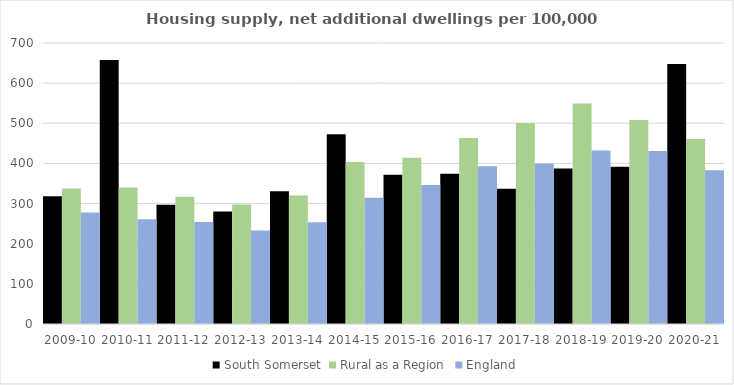
| Category | South Somerset | Rural as a Region | England |
|---|---|---|---|
| 2009-10 | 318.276 | 337.852 | 277.548 |
| 2010-11 | 657.918 | 340.105 | 260.994 |
| 2011-12 | 297.323 | 317.04 | 254.007 |
| 2012-13 | 280.303 | 297.763 | 233.153 |
| 2013-14 | 330.476 | 319.835 | 253.602 |
| 2014-15 | 472.597 | 403.796 | 314.256 |
| 2015-16 | 371.579 | 414.091 | 346.154 |
| 2016-17 | 374.116 | 463.209 | 393.256 |
| 2017-18 | 336.69 | 500.68 | 399.646 |
| 2018-19 | 387.225 | 549.491 | 432.099 |
| 2019-20 | 391.458 | 508.493 | 431.187 |
| 2020-21 | 647.911 | 461.114 | 382.827 |